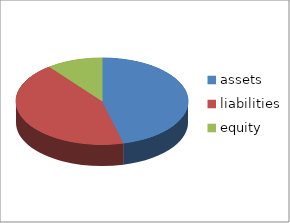
| Category | Series 0 |
|---|---|
| 0 | 513500 |
| 1 | 485000 |
| 2 | 116900 |